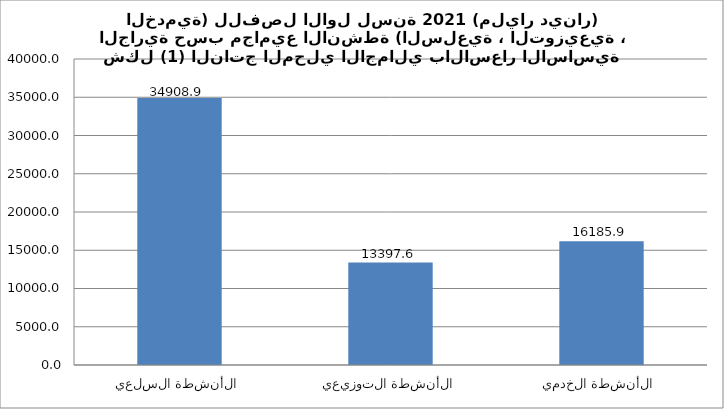
| Category | Series 0 |
|---|---|
| الأنشطة السلعية | 34908.9 |
| الأنشطة التوزيعية | 13397.6 |
| الأنشطة الخدمية | 16185.9 |